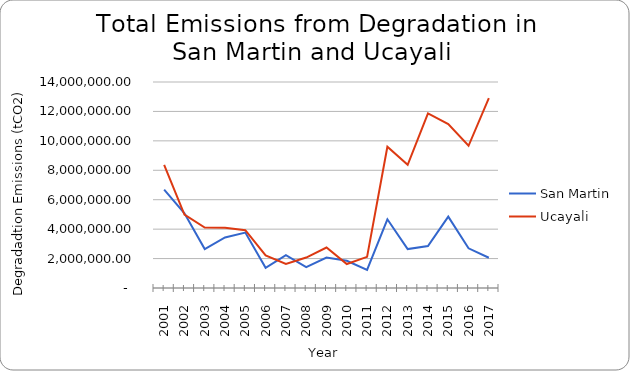
| Category | San Martin | Ucayali |
|---|---|---|
| 2001.0 | 6690089.79 | 8361434.779 |
| 2002.0 | 5079102.832 | 4989644.82 |
| 2003.0 | 2643418.388 | 4103645.352 |
| 2004.0 | 3436708.215 | 4090226.491 |
| 2005.0 | 3768363.562 | 3930770.501 |
| 2006.0 | 1374716.506 | 2218533.383 |
| 2007.0 | 2234657.525 | 1633928.933 |
| 2008.0 | 1423363.053 | 2069560.106 |
| 2009.0 | 2074728.327 | 2748895.01 |
| 2010.0 | 1852953.304 | 1629056.221 |
| 2011.0 | 1224744.714 | 2117478.034 |
| 2012.0 | 4671964.478 | 9599621.854 |
| 2013.0 | 2646015.264 | 8368685.762 |
| 2014.0 | 2853296.959 | 11863000.576 |
| 2015.0 | 4852619.259 | 11142653.948 |
| 2016.0 | 2697133.475 | 9665457.066 |
| 2017.0 | 2056339.076 | 12899433.187 |